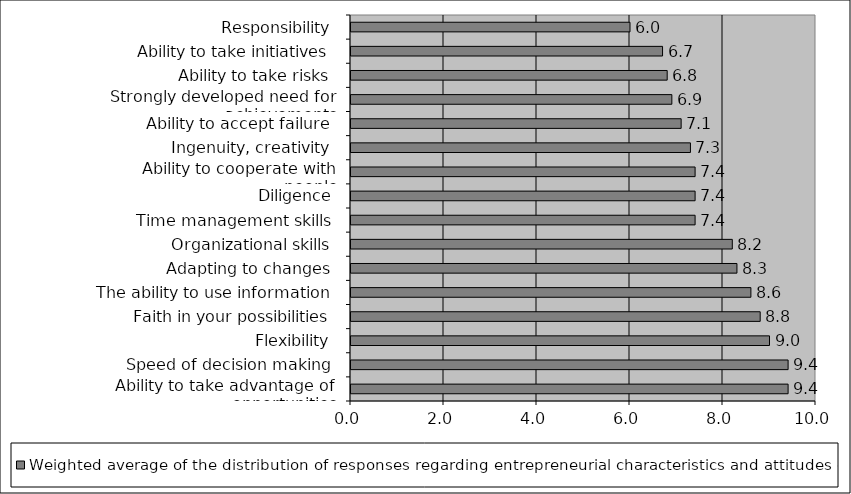
| Category | Weighted average of the distribution of responses regarding entrepreneurial characteristics and attitudes of students |
|---|---|
| Ability to take advantage of opportunities | 9.4 |
| Speed of decision making | 9.4 |
| Flexibility | 9 |
| Faith in your possibilities | 8.8 |
| The ability to use information | 8.6 |
| Adapting to changes | 8.3 |
| Organizational skills | 8.2 |
| Time management skills | 7.4 |
| Diligence | 7.4 |
| Ability to cooperate with people | 7.4 |
| Ingenuity, creativity | 7.3 |
| Ability to accept failure | 7.1 |
| Strongly developed need for achievements | 6.9 |
| Ability to take risks | 6.8 |
| Ability to take initiatives | 6.7 |
| Responsibility | 6 |